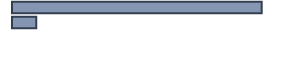
| Category | Series 0 |
|---|---|
| 0 | 91.128 |
| 1 | 8.872 |
| 2 | 0 |
| 3 | 0 |